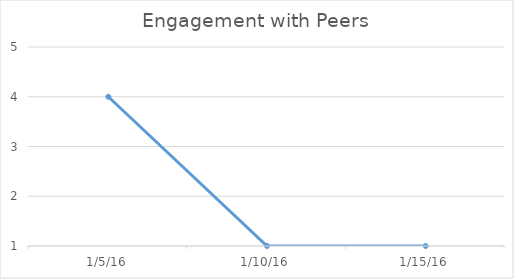
| Category | Series 0 |
|---|---|
| 1/5/16 | 4 |
| 1/10/16 | 1 |
| 1/15/16 | 1 |